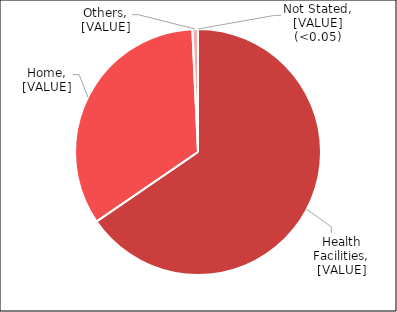
| Category | Series 0 |
|---|---|
| Health Facilities | 65.438 |
| Home | 33.823 |
| Others | 0.735 |
| Not Stated | 0 |